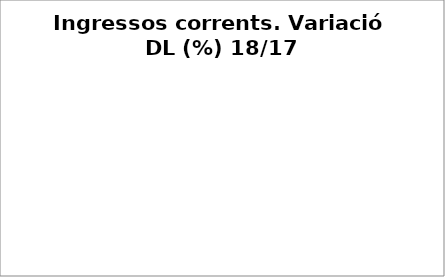
| Category | Series 0 |
|---|---|
| Impostos locals | -0.115 |
| Participació Tributs de l'Estat | 0.057 |
| Taxes i altres ingressos | 0.162 |
| Transferències corrents (exc. FCF) | 1.748 |
| Ingressos patrimonials | -0.087 |
| Ingressos corrents | -0.026 |